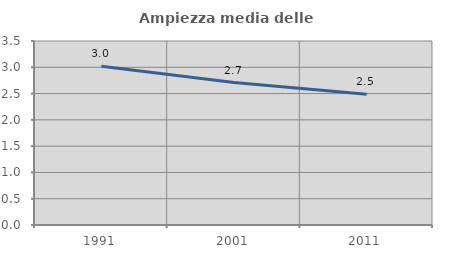
| Category | Ampiezza media delle famiglie |
|---|---|
| 1991.0 | 3.021 |
| 2001.0 | 2.71 |
| 2011.0 | 2.486 |